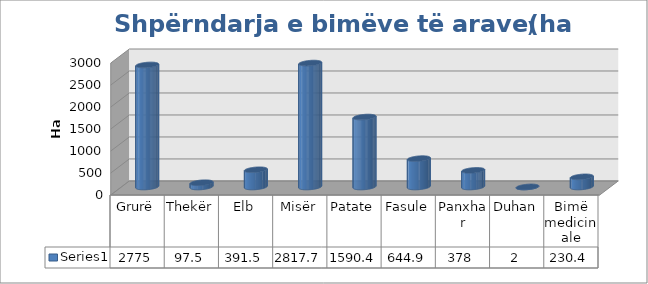
| Category | Series 0 |
|---|---|
| Grurë | 2775 |
| Thekër | 97.5 |
| Elb | 391.5 |
| Misër | 2817.7 |
| Patate | 1590.4 |
| Fasule | 644.9 |
| Panxhar | 378 |
| Duhan | 2 |
| Bimë medicinale | 230.4 |